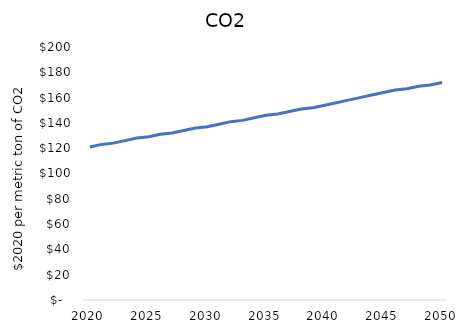
| Category | CO2 |
|---|---|
| 2020.0 | 121 |
| 2021.0 | 123 |
| 2022.0 | 124 |
| 2023.0 | 126 |
| 2024.0 | 128 |
| 2025.0 | 129 |
| 2026.0 | 131 |
| 2027.0 | 132 |
| 2028.0 | 134 |
| 2029.0 | 136 |
| 2030.0 | 137 |
| 2031.0 | 139 |
| 2032.0 | 141 |
| 2033.0 | 142 |
| 2034.0 | 144 |
| 2035.0 | 146 |
| 2036.0 | 147 |
| 2037.0 | 149 |
| 2038.0 | 151 |
| 2039.0 | 152 |
| 2040.0 | 154 |
| 2041.0 | 156 |
| 2042.0 | 158 |
| 2043.0 | 160 |
| 2044.0 | 162 |
| 2045.0 | 164 |
| 2046.0 | 166 |
| 2047.0 | 167 |
| 2048.0 | 169 |
| 2049.0 | 170 |
| 2050.0 | 172 |